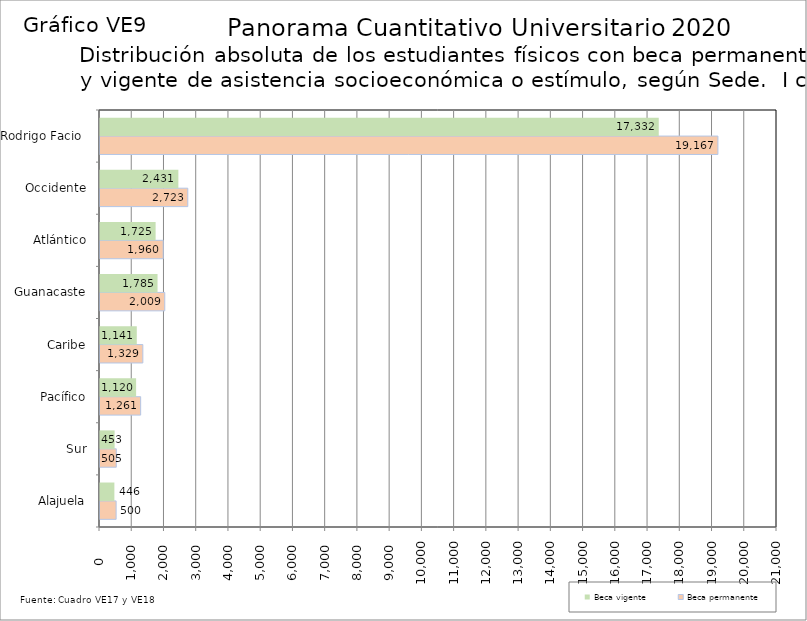
| Category | Beca permanente | Beca vigente |
|---|---|---|
| Alajuela | 500 | 446 |
| Sur | 505 | 453 |
| Pacífico | 1261 | 1120 |
| Caribe | 1329 | 1141 |
| Guanacaste | 2009 | 1785 |
| Atlántico | 1960 | 1725 |
| Occidente | 2723 | 2431 |
| Rodrigo Facio  | 19167 | 17332 |